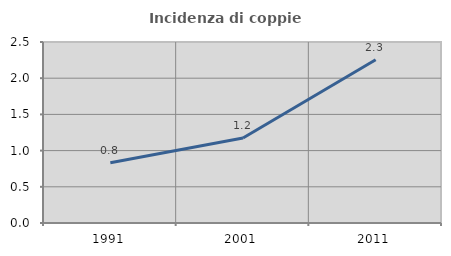
| Category | Incidenza di coppie miste |
|---|---|
| 1991.0 | 0.833 |
| 2001.0 | 1.174 |
| 2011.0 | 2.255 |